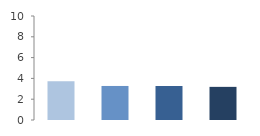
| Category | Rate (%) |
|---|---|
| 2009.0 | 3.737 |
| 2010.0 | 3.273 |
| 2011.0 | 3.268 |
| 2012.0 | 3.186 |